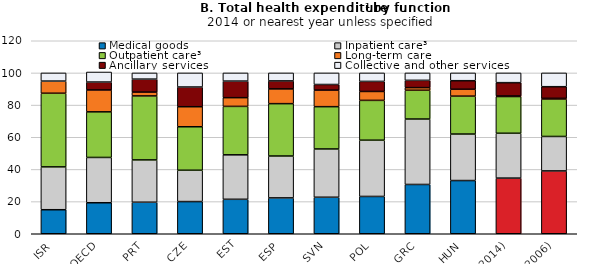
| Category | Medical goods | Inpatient care³ | Outpatient care³ | Long-term care  | Ancillary services | Collective and other services |
|---|---|---|---|---|---|---|
| ISR | 14.938 | 26.636 | 45.795 | 7.551 | 0 | 5.079 |
| OECD | 19.281 | 28.165 | 28.354 | 13.601 | 4.93 | 6.247 |
| PRT | 19.608 | 26.305 | 39.786 | 2.376 | 8.066 | 3.858 |
| CZE | 20.011 | 19.473 | 27.035 | 12.461 | 12.263 | 8.757 |
| EST | 21.429 | 27.643 | 30.116 | 5.43 | 10.307 | 5.075 |
| ESP | 22.292 | 26.043 | 32.553 | 9.18 | 4.972 | 4.96 |
| SVN | 22.701 | 30.017 | 26.302 | 10.286 | 3.495 | 7.2 |
| POL | 23.194 | 34.971 | 24.769 | 5.536 | 6.257 | 5.273 |
| GRC | 30.641 | 40.687 | 17.891 | 1.641 | 4.53 | 4.61 |
| HUN | 33.084 | 28.909 | 23.577 | 4.285 | 5.311 | 4.834 |
| SVK(2014) | 34.602 | 27.881 | 22.83 | 0.338 | 8.301 | 6.049 |
| SVK(2006) | 39.072 | 21.418 | 23.275 | 0.425 | 7.247 | 8.564 |